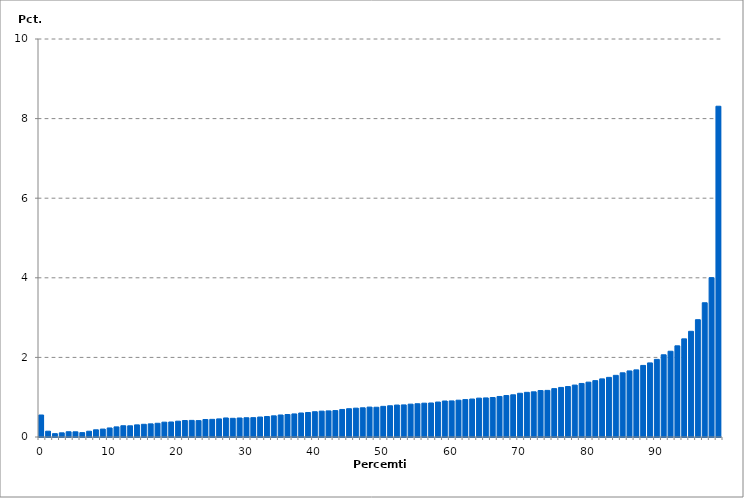
| Category | Nettoformue, ekskl. pension |
|---|---|
| 0.0 | 0.553 |
| 1.0 | 0.145 |
| 2.0 | 0.084 |
| 3.0 | 0.105 |
| 4.0 | 0.132 |
| 5.0 | 0.13 |
| 6.0 | 0.11 |
| 7.0 | 0.145 |
| 8.0 | 0.181 |
| 9.0 | 0.199 |
| 10.0 | 0.227 |
| 11.0 | 0.254 |
| 12.0 | 0.283 |
| 13.0 | 0.281 |
| 14.0 | 0.305 |
| 15.0 | 0.32 |
| 16.0 | 0.33 |
| 17.0 | 0.345 |
| 18.0 | 0.373 |
| 19.0 | 0.377 |
| 20.0 | 0.397 |
| 21.0 | 0.414 |
| 22.0 | 0.417 |
| 23.0 | 0.412 |
| 24.0 | 0.44 |
| 25.0 | 0.444 |
| 26.0 | 0.455 |
| 27.0 | 0.478 |
| 28.0 | 0.469 |
| 29.0 | 0.478 |
| 30.0 | 0.484 |
| 31.0 | 0.486 |
| 32.0 | 0.502 |
| 33.0 | 0.515 |
| 34.0 | 0.532 |
| 35.0 | 0.553 |
| 36.0 | 0.565 |
| 37.0 | 0.579 |
| 38.0 | 0.603 |
| 39.0 | 0.616 |
| 40.0 | 0.635 |
| 41.0 | 0.649 |
| 42.0 | 0.656 |
| 43.0 | 0.664 |
| 44.0 | 0.692 |
| 45.0 | 0.711 |
| 46.0 | 0.725 |
| 47.0 | 0.733 |
| 48.0 | 0.751 |
| 49.0 | 0.748 |
| 50.0 | 0.77 |
| 51.0 | 0.785 |
| 52.0 | 0.803 |
| 53.0 | 0.806 |
| 54.0 | 0.825 |
| 55.0 | 0.836 |
| 56.0 | 0.85 |
| 57.0 | 0.854 |
| 58.0 | 0.878 |
| 59.0 | 0.904 |
| 60.0 | 0.907 |
| 61.0 | 0.925 |
| 62.0 | 0.94 |
| 63.0 | 0.954 |
| 64.0 | 0.976 |
| 65.0 | 0.982 |
| 66.0 | 0.992 |
| 67.0 | 1.018 |
| 68.0 | 1.042 |
| 69.0 | 1.06 |
| 70.0 | 1.099 |
| 71.0 | 1.122 |
| 72.0 | 1.135 |
| 73.0 | 1.167 |
| 74.0 | 1.171 |
| 75.0 | 1.215 |
| 76.0 | 1.245 |
| 77.0 | 1.268 |
| 78.0 | 1.304 |
| 79.0 | 1.345 |
| 80.0 | 1.378 |
| 81.0 | 1.416 |
| 82.0 | 1.46 |
| 83.0 | 1.498 |
| 84.0 | 1.549 |
| 85.0 | 1.613 |
| 86.0 | 1.66 |
| 87.0 | 1.687 |
| 88.0 | 1.798 |
| 89.0 | 1.861 |
| 90.0 | 1.951 |
| 91.0 | 2.066 |
| 92.0 | 2.155 |
| 93.0 | 2.291 |
| 94.0 | 2.466 |
| 95.0 | 2.656 |
| 96.0 | 2.947 |
| 97.0 | 3.373 |
| 98.0 | 4.004 |
| 99.0 | 8.311 |